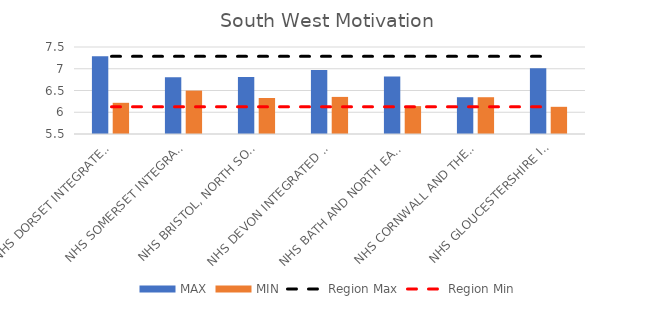
| Category | MAX | MIN |
|---|---|---|
| NHS DORSET INTEGRATED CARE BOARD | 7.285 | 6.217 |
| NHS SOMERSET INTEGRATED CARE BOARD | 6.806 | 6.498 |
| NHS BRISTOL, NORTH SOMERSET AND SOUTH GLOUCESTERSHIRE INTEGRATED CARE BOARD | 6.811 | 6.328 |
| NHS DEVON INTEGRATED CARE BOARD | 6.972 | 6.353 |
| NHS BATH AND NORTH EAST SOMERSET, SWINDON AND WILTSHIRE INTEGRATED CARE BOARD | 6.824 | 6.141 |
| NHS CORNWALL AND THE ISLES OF SCILLY INTEGRATED CARE BOARD | 6.345 | 6.345 |
| NHS GLOUCESTERSHIRE INTEGRATED CARE BOARD | 7.013 | 6.125 |